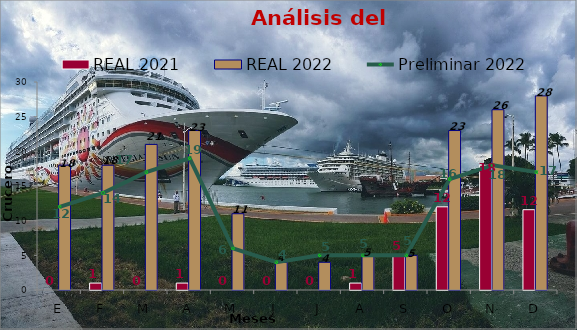
| Category | REAL 2021 | REAL 2022 |
|---|---|---|
| E | 0 | 18 |
| F | 1 | 18 |
| M | 0 | 21 |
| A | 1 | 23 |
| M | 0 | 11 |
| J | 0 | 4 |
| J | 0 | 4 |
| A | 1 | 5 |
| S | 5 | 5 |
| O | 12 | 23 |
| N | 18 | 26 |
| D | 11.582 | 28 |